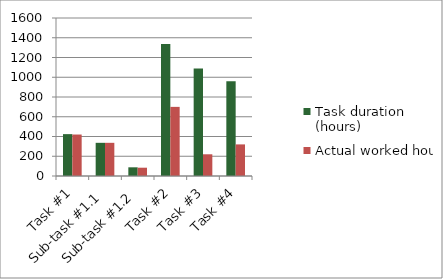
| Category | Task duration (hours) | Actual worked hours |
|---|---|---|
| Task #1 | 424 | 420 |
| Sub-task #1.1 | 336 | 336 |
| Sub-task #1.2 | 88 | 84 |
| Task #2 | 1336 | 700 |
| Task #3 | 1088 | 220 |
| Task #4 | 960 | 320 |